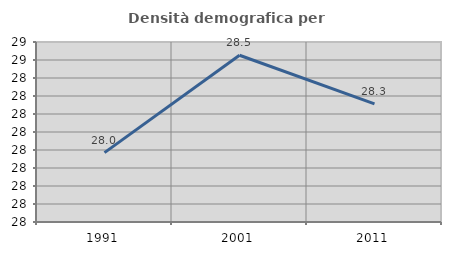
| Category | Densità demografica |
|---|---|
| 1991.0 | 27.985 |
| 2001.0 | 28.526 |
| 2011.0 | 28.256 |